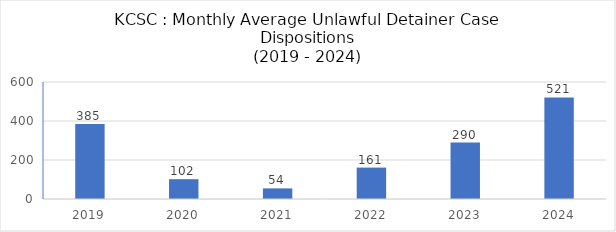
| Category | Series 0 |
|---|---|
| 2019.0 | 384.75 |
| 2020.0 | 101.583 |
| 2021.0 | 54.417 |
| 2022.0 | 161 |
| 2023.0 | 289.667 |
| 2024.0 | 520.667 |